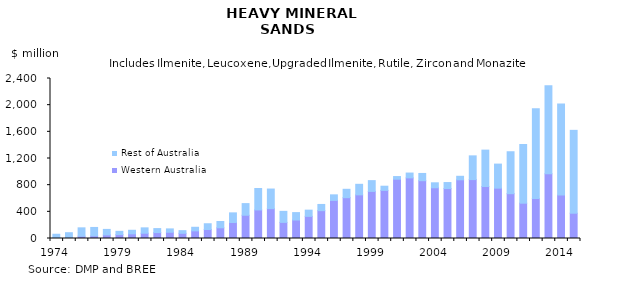
| Category | Western Australia | Rest of Australia |
|---|---|---|
| 1974.0 | 11.077 | 52.602 |
| 1975.0 | 16.463 | 70.381 |
| 1976.0 | 34.527 | 125.496 |
| 1977.0 | 39.788 | 125.918 |
| 1978.0 | 54.31 | 82.043 |
| 1979.0 | 58.998 | 48.428 |
| 1980.0 | 69.875 | 53.506 |
| 1981.0 | 79.037 | 80.616 |
| 1982.0 | 88.623 | 60.095 |
| 1983.0 | 93.353 | 50.807 |
| 1984.0 | 77.817 | 39.991 |
| 1985.0 | 114.569 | 53.792 |
| 1986.0 | 134.962 | 86.35 |
| 1987.0 | 160.577 | 94.356 |
| 1988.0 | 240.223 | 144.405 |
| 1989.0 | 348.835 | 174.675 |
| 1990.0 | 428.313 | 321.477 |
| 1991.0 | 447.623 | 294.352 |
| 1992.0 | 241.626 | 165.518 |
| 1993.0 | 276.837 | 111.675 |
| 1994.0 | 332.056 | 93.207 |
| 1995.0 | 417.667 | 93.063 |
| 1996.0 | 571.349 | 83.489 |
| 1997.0 | 612.206 | 125.882 |
| 1998.0 | 654.698 | 158.197 |
| 1999.0 | 706.242 | 161.779 |
| 2000.0 | 721.354 | 63.105 |
| 2001.0 | 889.254 | 40.072 |
| 2002.0 | 909.224 | 72.447 |
| 2003.0 | 866.852 | 108.806 |
| 2004.0 | 760.749 | 74.724 |
| 2005.0 | 749.077 | 90.11 |
| 2006.0 | 880.375 | 52.771 |
| 2007.0 | 883.666 | 355.967 |
| 2008.0 | 780.276 | 545.456 |
| 2009.0 | 755.308 | 360.679 |
| 2010.0 | 672.367 | 628.934 |
| 2011.0 | 529.641 | 880.785 |
| 2012.0 | 598.899 | 1345.504 |
| 2013.0 | 970.489 | 1320.369 |
| 2014.0 | 650.922 | 1367.4 |